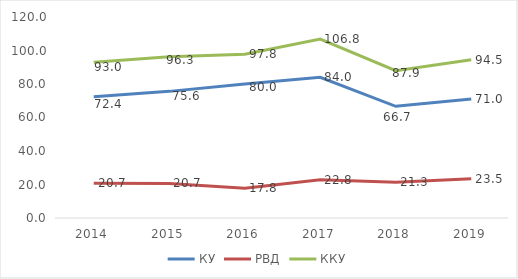
| Category | КУ | РВД | ККУ |
|---|---|---|---|
| 2014.0 | 72.35 | 20.68 | 93.03 |
| 2015.0 | 75.6 | 20.65 | 96.25 |
| 2016.0 | 80 | 17.8 | 97.8 |
| 2017.0 | 84 | 22.8 | 106.8 |
| 2018.0 | 66.673 | 21.27 | 87.943 |
| 2019.0 | 71 | 23.5 | 94.5 |